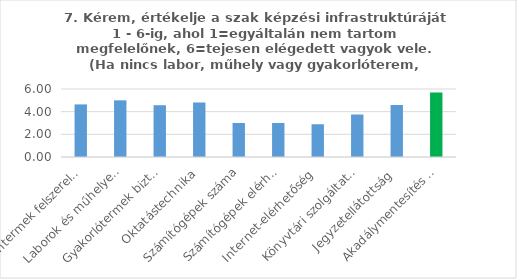
| Category | Series 0 |
|---|---|
| Tantermek felszereltsége | 4.64 |
| Laborok és műhelyek, műtermek felszereltsége | 5 |
| Gyakorlótermek biztosítása | 4.57 |
| Oktatástechnika | 4.81 |
| Számítógépek száma | 3 |
| Számítógépek elérhetősége | 3 |
| Internet-elérhetőség | 2.89 |
| Könyvtári szolgáltatások | 3.75 |
| Jegyzetellátottság | 4.59 |
| Akadálymentesítés minősége | 5.7 |